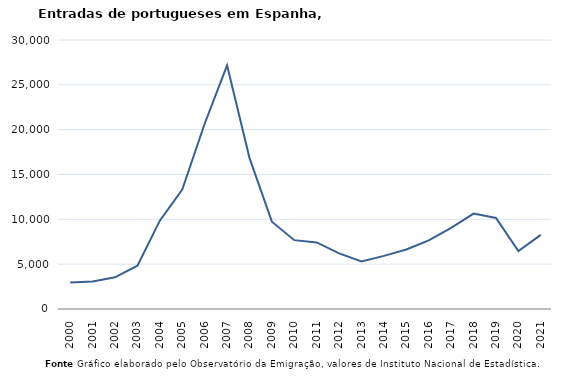
| Category | Entradas |
|---|---|
| 2000.0 | 2955 |
| 2001.0 | 3057 |
| 2002.0 | 3538 |
| 2003.0 | 4825 |
| 2004.0 | 9851 |
| 2005.0 | 13327 |
| 2006.0 | 20658 |
| 2007.0 | 27178 |
| 2008.0 | 16857 |
| 2009.0 | 9739 |
| 2010.0 | 7678 |
| 2011.0 | 7424 |
| 2012.0 | 6201 |
| 2013.0 | 5302 |
| 2014.0 | 5923 |
| 2015.0 | 6638 |
| 2016.0 | 7646 |
| 2017.0 | 9038 |
| 2018.0 | 10636 |
| 2019.0 | 10155 |
| 2020.0 | 6471 |
| 2021.0 | 8272 |